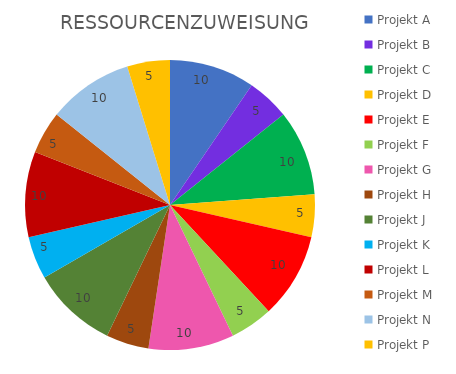
| Category | Series 0 |
|---|---|
| Projekt A | 10 |
| Projekt B | 5 |
| Projekt C | 10 |
| Projekt D | 5 |
| Projekt E | 10 |
| Projekt F | 5 |
| Projekt G | 10 |
| Projekt H | 5 |
| Projekt J | 10 |
| Projekt K | 5 |
| Projekt L | 10 |
| Projekt M | 5 |
| Projekt N | 10 |
| Projekt P | 5 |